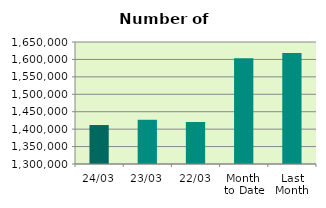
| Category | Series 0 |
|---|---|
| 24/03 | 1411786 |
| 23/03 | 1426872 |
| 22/03 | 1420564 |
| Month 
to Date | 1603119.778 |
| Last
Month | 1618522.4 |